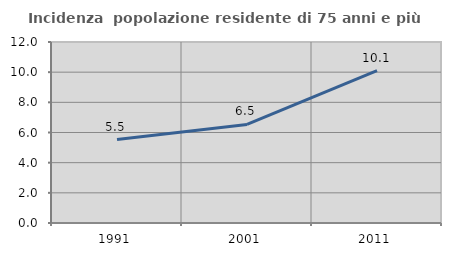
| Category | Incidenza  popolazione residente di 75 anni e più |
|---|---|
| 1991.0 | 5.534 |
| 2001.0 | 6.533 |
| 2011.0 | 10.101 |